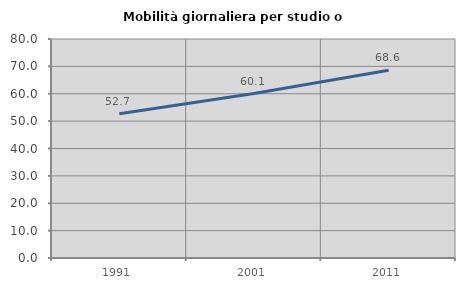
| Category | Mobilità giornaliera per studio o lavoro |
|---|---|
| 1991.0 | 52.712 |
| 2001.0 | 60.057 |
| 2011.0 | 68.555 |